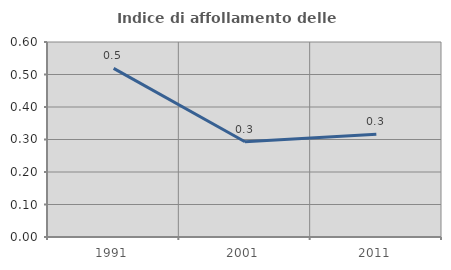
| Category | Indice di affollamento delle abitazioni  |
|---|---|
| 1991.0 | 0.519 |
| 2001.0 | 0.293 |
| 2011.0 | 0.317 |